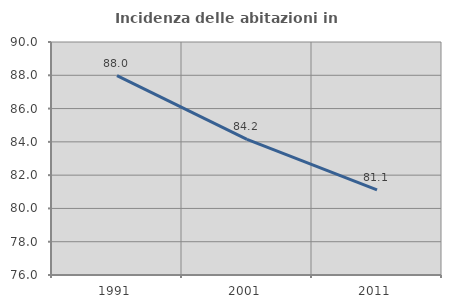
| Category | Incidenza delle abitazioni in proprietà  |
|---|---|
| 1991.0 | 87.977 |
| 2001.0 | 84.153 |
| 2011.0 | 81.117 |